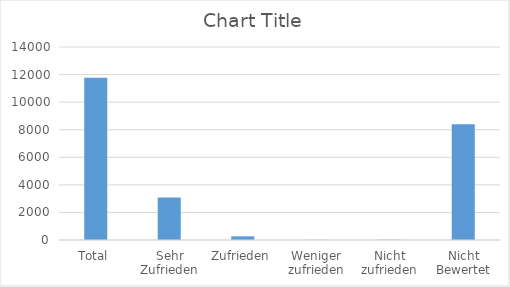
| Category | Series 0 |
|---|---|
| Total | 11773 |
| Sehr Zufrieden | 3079 |
| Zufrieden | 266 |
| Weniger zufrieden | 11 |
| Nicht zufrieden | 18 |
| Nicht Bewertet | 8399 |